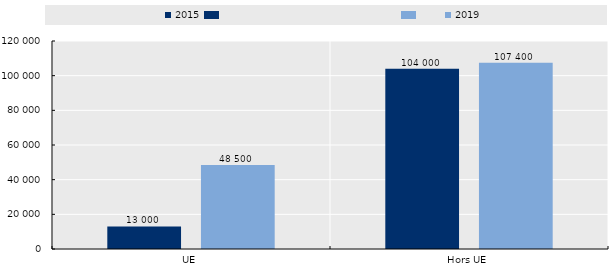
| Category | 2015 | 2019 |
|---|---|---|
| UE | 13000 | 48500 |
| Hors UE | 104000 | 107400 |